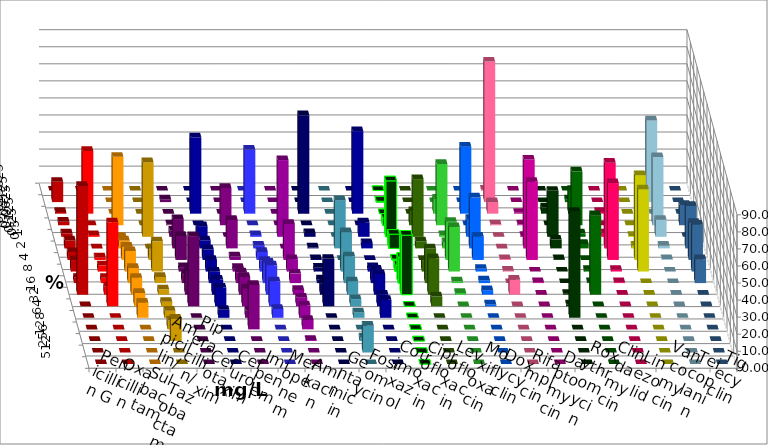
| Category | Penicillin G | Oxacillin | Ampicillin/ Sulbactam | Piperacillin/ Tazobactam | Cefotaxim | Cefuroxim | Imipenem | Meropenem | Amikacin | Gentamicin | Fosfomycin | Cotrimoxazol | Ciprofloxacin | Levofloxacin | Moxifloxacin | Doxycyclin | Rifampicin | Daptomycin | Roxythromycin | Clindamycin | Linezolid | Vancomycin | Teicoplanin | Tigecyclin |
|---|---|---|---|---|---|---|---|---|---|---|---|---|---|---|---|---|---|---|---|---|---|---|---|---|
| 0.015625 | 0 | 0 | 0 | 0 | 0 | 0 | 0 | 0 | 0 | 0 | 0 | 0 | 0 | 0 | 0 | 0 | 0.518 | 0 | 0 | 0 | 0 | 0 | 0 | 0 |
| 0.03125 | 11.917 | 0 | 0 | 0 | 1.562 | 0 | 0 | 0 | 0 | 0 | 0 | 0 | 0.521 | 0 | 0 | 0 | 82.383 | 0 | 0 | 1.554 | 0 | 0 | 0 | 47.895 |
| 0.0625 | 1.036 | 36.788 | 0 | 0 | 0 | 0 | 44.792 | 37.5 | 0 | 57.778 | 0 | 48.421 | 0 | 0 | 8.854 | 39.267 | 6.736 | 0.521 | 3.627 | 13.99 | 1.036 | 0 | 0 | 0 |
| 0.125 | 2.073 | 0 | 40.104 | 0 | 0.521 | 21.875 | 0 | 0 | 0 | 0 | 0 | 0 | 4.167 | 8.333 | 35.938 | 0 | 0.518 | 0.521 | 0 | 31.606 | 0 | 0 | 11.917 | 40 |
| 0.25 | 2.073 | 1.036 | 0 | 43.75 | 3.646 | 0 | 6.25 | 1.042 | 45 | 2.222 | 0 | 8.421 | 32.812 | 33.854 | 1.042 | 10.471 | 0 | 0.521 | 26.943 | 2.073 | 2.073 | 0.518 | 0 | 10 |
| 0.5 | 4.663 | 0 | 4.688 | 0 | 17.188 | 16.667 | 4.688 | 1.562 | 0 | 0.556 | 28.272 | 3.158 | 8.333 | 4.167 | 3.646 | 29.843 | 0 | 52.083 | 5.181 | 2.591 | 50.259 | 1.554 | 24.87 | 1.579 |
| 1.0 | 4.663 | 1.554 | 7.812 | 6.771 | 14.062 | 2.083 | 6.25 | 4.688 | 21.111 | 0.556 | 0 | 0 | 0.521 | 0 | 22.396 | 13.613 | 0.518 | 45.833 | 0.518 | 0 | 45.078 | 49.741 | 21.762 | 0.526 |
| 2.0 | 6.736 | 3.627 | 11.979 | 17.708 | 2.604 | 2.083 | 6.771 | 6.25 | 7.222 | 2.222 | 23.037 | 2.632 | 3.646 | 6.25 | 26.042 | 1.571 | 0.518 | 0 | 0 | 1.036 | 1.036 | 48.187 | 27.461 | 0 |
| 4.0 | 3.109 | 3.109 | 8.854 | 3.646 | 5.208 | 6.25 | 6.771 | 11.979 | 5.556 | 2.222 | 15.707 | 7.895 | 15.104 | 20.312 | 1.042 | 1.571 | 0 | 0.521 | 0 | 0.518 | 0.518 | 0 | 13.99 | 0 |
| 8.0 | 63.731 | 4.663 | 9.896 | 3.125 | 14.062 | 10.417 | 8.854 | 17.188 | 2.778 | 6.667 | 7.853 | 12.105 | 34.896 | 21.354 | 1.042 | 2.618 | 8.808 | 0 | 0.518 | 46.632 | 0 | 0 | 0 | 0 |
| 16.0 | 0 | 49.223 | 7.812 | 2.604 | 41.146 | 10.417 | 10.938 | 14.583 | 5 | 27.778 | 4.188 | 6.842 | 0 | 5.729 | 0 | 1.047 | 0 | 0 | 1.036 | 0 | 0 | 0 | 0 | 0 |
| 32.0 | 0 | 0 | 8.854 | 4.167 | 0 | 4.167 | 4.688 | 5.208 | 7.222 | 0 | 3.141 | 10.526 | 0 | 0 | 0 | 0 | 0 | 0 | 62.176 | 0 | 0 | 0 | 0 | 0 |
| 64.0 | 0 | 0 | 0 | 5.208 | 0 | 26.042 | 0 | 0 | 5.556 | 0 | 0 | 0 | 0 | 0 | 0 | 0 | 0 | 0 | 0 | 0 | 0 | 0 | 0 | 0 |
| 128.0 | 0 | 0 | 0 | 13.021 | 0 | 0 | 0 | 0 | 0.556 | 0 | 2.094 | 0 | 0 | 0 | 0 | 0 | 0 | 0 | 0 | 0 | 0 | 0 | 0 | 0 |
| 256.0 | 0 | 0 | 0 | 0 | 0 | 0 | 0 | 0 | 0 | 0 | 15.707 | 0 | 0 | 0 | 0 | 0 | 0 | 0 | 0 | 0 | 0 | 0 | 0 | 0 |
| 512.0 | 0 | 0 | 0 | 0 | 0 | 0 | 0 | 0 | 0 | 0 | 0 | 0 | 0 | 0 | 0 | 0 | 0 | 0 | 0 | 0 | 0 | 0 | 0 | 0 |